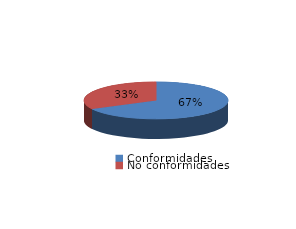
| Category | Series 0 |
|---|---|
| Conformidades | 2570 |
| No conformidades | 1246 |